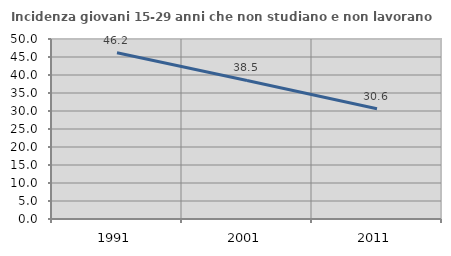
| Category | Incidenza giovani 15-29 anni che non studiano e non lavorano  |
|---|---|
| 1991.0 | 46.168 |
| 2001.0 | 38.487 |
| 2011.0 | 30.641 |